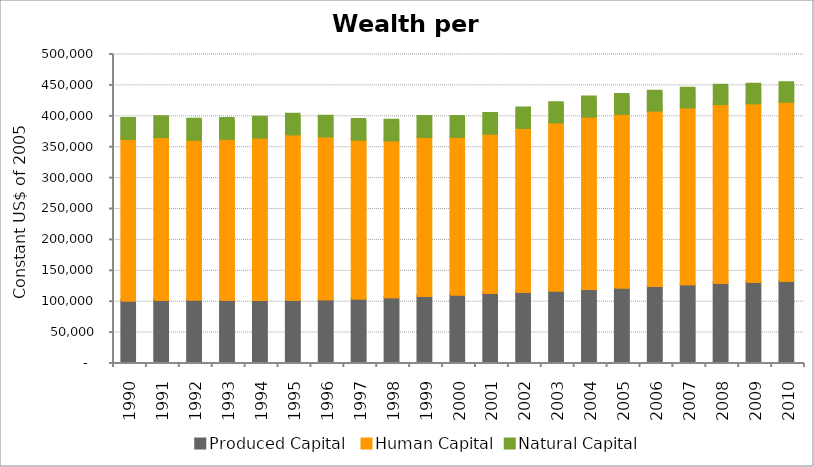
| Category | Produced Capital  | Human Capital | Natural Capital |
|---|---|---|---|
| 1990.0 | 99518.3 | 261614.883 | 32825.631 |
| 1991.0 | 100865.436 | 263091.999 | 32833.458 |
| 1992.0 | 101164.078 | 258718.02 | 32762.035 |
| 1993.0 | 100750.57 | 260666.965 | 32680.902 |
| 1994.0 | 100365.876 | 263002.753 | 32674.769 |
| 1995.0 | 100667.505 | 267733.767 | 32462.253 |
| 1996.0 | 101453.2 | 263752.237 | 32442.295 |
| 1997.0 | 102791.368 | 257147.491 | 32517.475 |
| 1998.0 | 104730.186 | 253983.117 | 32613.155 |
| 1999.0 | 106792.644 | 257684.367 | 32633.291 |
| 2000.0 | 109161.21 | 255456.577 | 32583.313 |
| 2001.0 | 111602.488 | 258053.515 | 32283.134 |
| 2002.0 | 113656.161 | 265269.943 | 31994.819 |
| 2003.0 | 115782.639 | 272046.178 | 31695.795 |
| 2004.0 | 118088.65 | 279149.454 | 31381.471 |
| 2005.0 | 120473.356 | 281289.069 | 31069.655 |
| 2006.0 | 122792.75 | 284316.481 | 30975.394 |
| 2007.0 | 125718.412 | 286350.706 | 30824.645 |
| 2008.0 | 128377.388 | 288930.288 | 30675.673 |
| 2009.0 | 129788.58 | 288947.199 | 30530.884 |
| 2010.0 | 131355.517 | 289975.425 | 30393.96 |